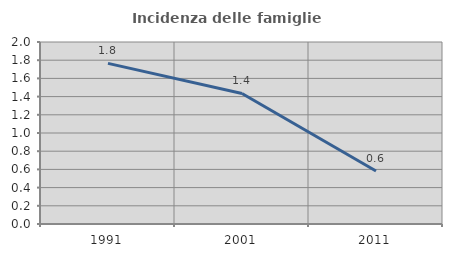
| Category | Incidenza delle famiglie numerose |
|---|---|
| 1991.0 | 1.765 |
| 2001.0 | 1.435 |
| 2011.0 | 0.582 |